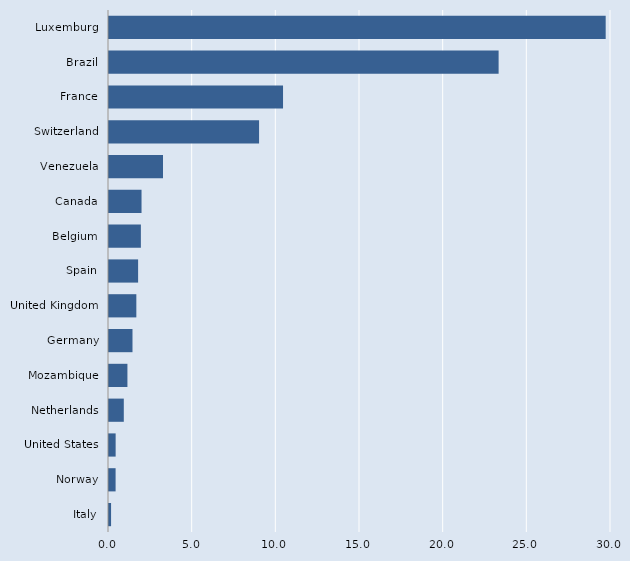
| Category | Series 0 |
|---|---|
| Italy | 0.123 |
| Norway | 0.394 |
| United States | 0.397 |
| Netherlands | 0.884 |
| Mozambique | 1.101 |
| Germany | 1.404 |
| United Kingdom | 1.634 |
| Spain | 1.74 |
| Belgium | 1.905 |
| Canada | 1.944 |
| Venezuela | 3.227 |
| Switzerland | 8.968 |
| France | 10.4 |
| Brazil | 23.284 |
| Luxemburg | 29.682 |